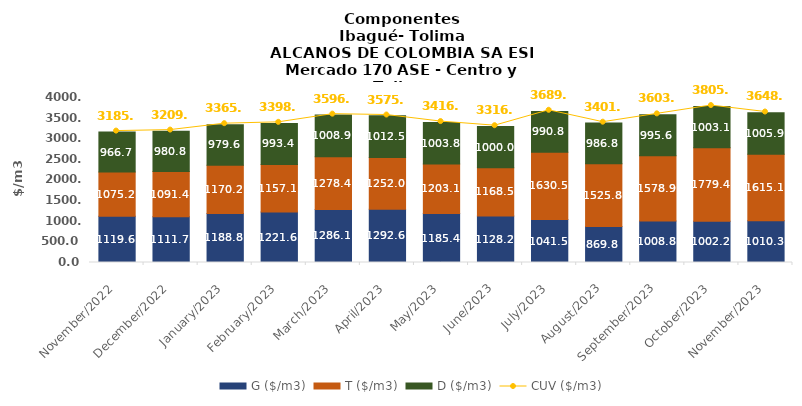
| Category | G ($/m3) | T ($/m3) | D ($/m3) |
|---|---|---|---|
| 2022-11-01 | 1119.61 | 1075.19 | 966.69 |
| 2022-12-01 | 1111.69 | 1091.36 | 980.8 |
| 2023-01-01 | 1188.81 | 1170.15 | 979.57 |
| 2023-02-01 | 1221.59 | 1157.08 | 993.4 |
| 2023-03-01 | 1286.09 | 1278.38 | 1008.86 |
| 2023-04-01 | 1292.6 | 1251.95 | 1012.48 |
| 2023-05-01 | 1185.42 | 1203.07 | 1003.78 |
| 2023-06-01 | 1128.21 | 1168.47 | 999.96 |
| 2023-07-01 | 1041.54 | 1630.51 | 990.77 |
| 2023-08-01 | 869.82 | 1525.81 | 986.78 |
| 2023-09-01 | 1008.82 | 1578.87 | 995.55 |
| 2023-10-01 | 1002.24 | 1779.41 | 1003.05 |
| 2023-11-01 | 1010.34 | 1615.11 | 1005.88 |